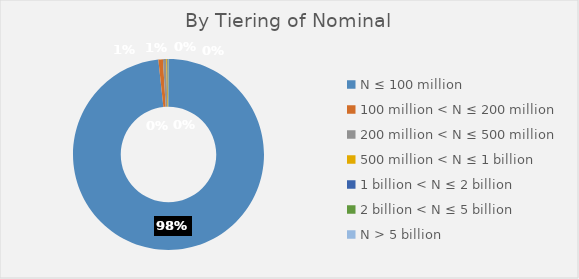
| Category | E. Tiering Nominal |
|---|---|
| N ≤ 100 million | 334422484 |
| 100 million < N ≤ 200 million | 2623568 |
| 200 million < N ≤ 500 million | 1840085 |
| 500 million < N ≤ 1 billion | 709250 |
| 1 billion < N ≤ 2 billion | 317772 |
| 2 billion < N ≤ 5 billion | 185273 |
| N > 5 billion | 108535 |